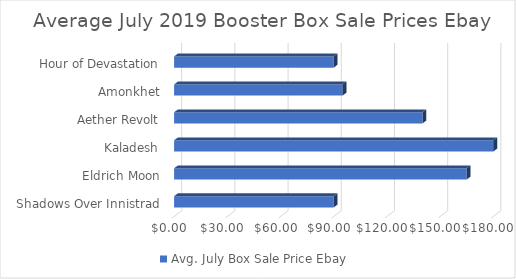
| Category | Avg. July Box Sale Price Ebay  |
|---|---|
| Shadows Over Innistrad | 90 |
| Eldrich Moon | 165 |
| Kaladesh | 180 |
| Aether Revolt | 140 |
| Amonkhet | 95 |
| Hour of Devastation | 90 |